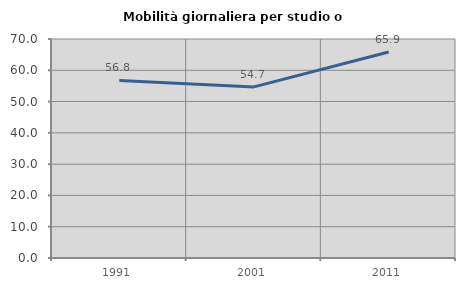
| Category | Mobilità giornaliera per studio o lavoro |
|---|---|
| 1991.0 | 56.769 |
| 2001.0 | 54.688 |
| 2011.0 | 65.854 |